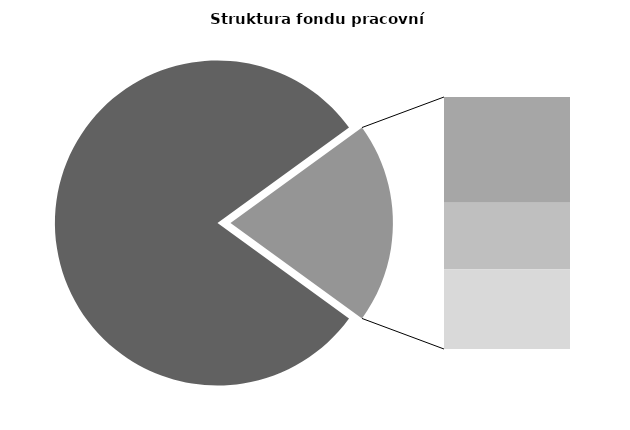
| Category | Series 0 |
|---|---|
| Průměrná měsíční odpracovaná doba bez přesčasu | 136.463 |
| Dovolená | 14.306 |
| Nemoc | 8.996 |
| Jiné | 10.783 |